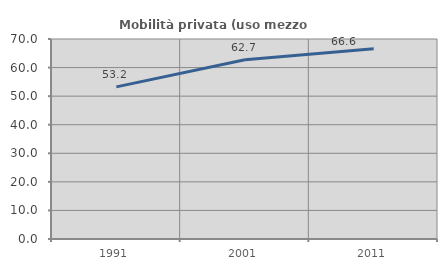
| Category | Mobilità privata (uso mezzo privato) |
|---|---|
| 1991.0 | 53.249 |
| 2001.0 | 62.715 |
| 2011.0 | 66.573 |